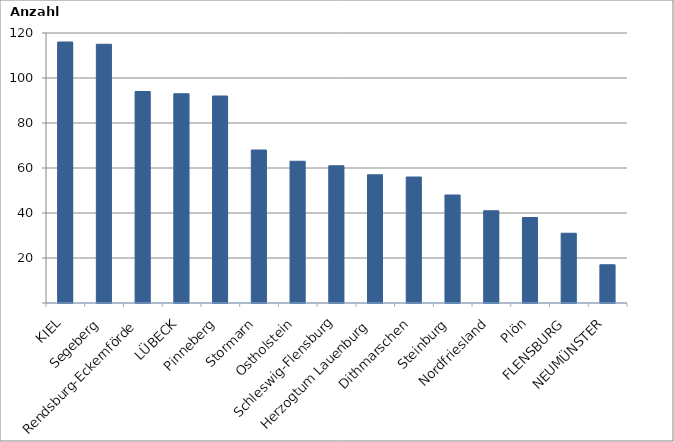
| Category | Series 0 |
|---|---|
| KIEL | 116 |
| Segeberg | 115 |
| Rendsburg-Eckernförde | 94 |
| LÜBECK | 93 |
| Pinneberg | 92 |
| Stormarn | 68 |
| Ostholstein | 63 |
| Schleswig-Flensburg | 61 |
| Herzogtum Lauenburg | 57 |
| Dithmarschen | 56 |
| Steinburg | 48 |
| Nordfriesland | 41 |
| Plön | 38 |
| FLENSBURG | 31 |
| NEUMÜNSTER | 17 |